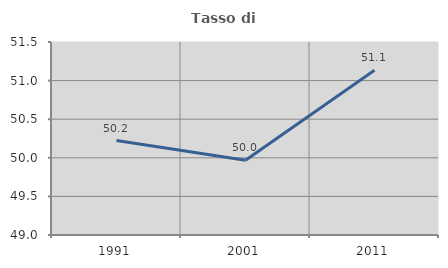
| Category | Tasso di occupazione   |
|---|---|
| 1991.0 | 50.224 |
| 2001.0 | 49.967 |
| 2011.0 | 51.134 |